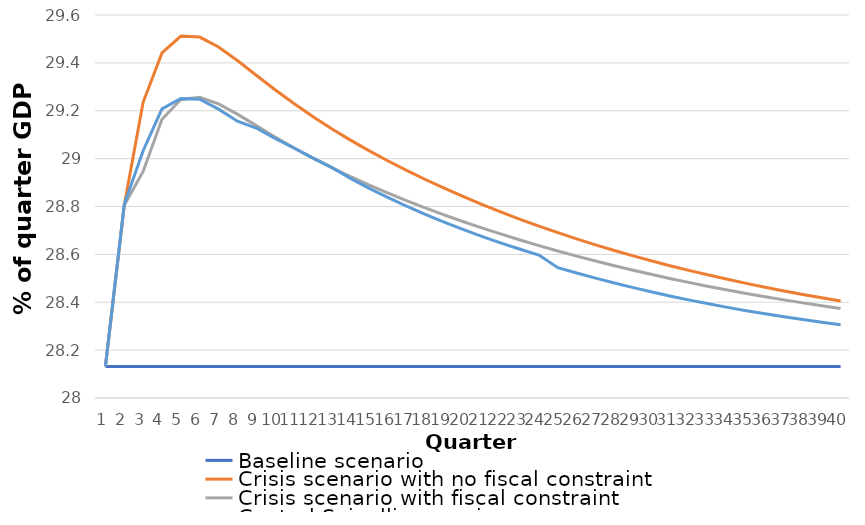
| Category | Baseline scenario | Crisis scenario with no fiscal constraint | Crisis scenario with fiscal constraint | Central Spinelli scenario |
|---|---|---|---|---|
| 0 | 28.132 | 28.132 | 28.132 | 28.132 |
| 1 | 28.132 | 28.805 | 28.805 | 28.809 |
| 2 | 28.132 | 29.235 | 28.946 | 29.033 |
| 3 | 28.132 | 29.441 | 29.164 | 29.208 |
| 4 | 28.132 | 29.512 | 29.247 | 29.251 |
| 5 | 28.132 | 29.508 | 29.256 | 29.248 |
| 6 | 28.132 | 29.466 | 29.229 | 29.207 |
| 7 | 28.132 | 29.41 | 29.186 | 29.156 |
| 8 | 28.132 | 29.348 | 29.138 | 29.128 |
| 9 | 28.132 | 29.288 | 29.09 | 29.085 |
| 10 | 28.132 | 29.23 | 29.045 | 29.045 |
| 11 | 28.132 | 29.176 | 29.002 | 29.003 |
| 12 | 28.132 | 29.125 | 28.962 | 28.964 |
| 13 | 28.132 | 29.077 | 28.925 | 28.918 |
| 14 | 28.132 | 29.032 | 28.889 | 28.876 |
| 15 | 28.132 | 28.99 | 28.856 | 28.837 |
| 16 | 28.132 | 28.95 | 28.824 | 28.8 |
| 17 | 28.132 | 28.912 | 28.793 | 28.766 |
| 18 | 28.132 | 28.875 | 28.764 | 28.734 |
| 19 | 28.132 | 28.841 | 28.736 | 28.703 |
| 20 | 28.132 | 28.808 | 28.71 | 28.674 |
| 21 | 28.132 | 28.776 | 28.684 | 28.647 |
| 22 | 28.132 | 28.746 | 28.66 | 28.621 |
| 23 | 28.132 | 28.718 | 28.636 | 28.597 |
| 24 | 28.132 | 28.691 | 28.614 | 28.544 |
| 25 | 28.132 | 28.665 | 28.593 | 28.522 |
| 26 | 28.132 | 28.64 | 28.572 | 28.501 |
| 27 | 28.132 | 28.616 | 28.552 | 28.48 |
| 28 | 28.132 | 28.594 | 28.534 | 28.461 |
| 29 | 28.132 | 28.572 | 28.516 | 28.443 |
| 30 | 28.132 | 28.552 | 28.498 | 28.425 |
| 31 | 28.132 | 28.532 | 28.482 | 28.409 |
| 32 | 28.132 | 28.514 | 28.466 | 28.393 |
| 33 | 28.132 | 28.496 | 28.451 | 28.379 |
| 34 | 28.132 | 28.479 | 28.437 | 28.365 |
| 35 | 28.132 | 28.463 | 28.423 | 28.352 |
| 36 | 28.132 | 28.447 | 28.41 | 28.339 |
| 37 | 28.132 | 28.433 | 28.397 | 28.328 |
| 38 | 28.132 | 28.419 | 28.385 | 28.317 |
| 39 | 28.132 | 28.405 | 28.374 | 28.306 |